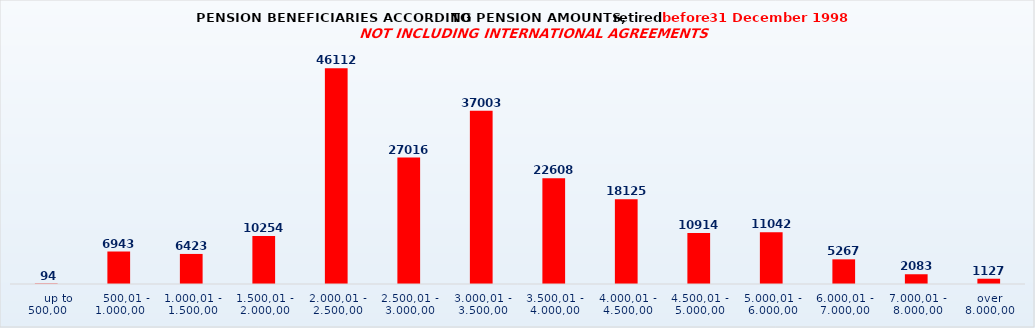
| Category | Series 0 |
|---|---|
|      up to 500,00 | 94 |
|    500,01 - 1.000,00 | 6943 |
| 1.000,01 - 1.500,00 | 6423 |
| 1.500,01 - 2.000,00 | 10254 |
| 2.000,01 - 2.500,00 | 46112 |
| 2.500,01 - 3.000,00 | 27016 |
| 3.000,01 - 3.500,00 | 37003 |
| 3.500,01 - 4.000,00 | 22608 |
| 4.000,01 - 4.500,00 | 18125 |
| 4.500,01 - 5.000,00 | 10914 |
| 5.000,01 - 6.000,00 | 11042 |
| 6.000,01 - 7.000,00 | 5267 |
| 7.000,01 - 8.000,00 | 2083 |
| over 8.000,00 | 1127 |